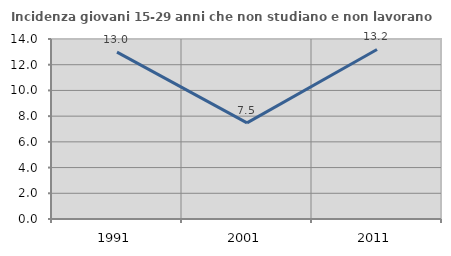
| Category | Incidenza giovani 15-29 anni che non studiano e non lavorano  |
|---|---|
| 1991.0 | 12.982 |
| 2001.0 | 7.479 |
| 2011.0 | 13.187 |